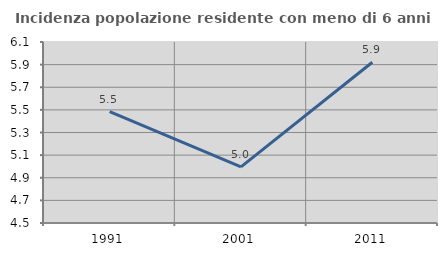
| Category | Incidenza popolazione residente con meno di 6 anni |
|---|---|
| 1991.0 | 5.484 |
| 2001.0 | 4.996 |
| 2011.0 | 5.921 |